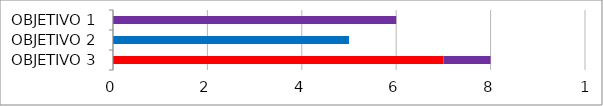
| Category | Series 0 | Series 1 | Series 2 |
|---|---|---|---|
| OBJETIVO 1 | 0 | 6 | 0 |
| OBJETIVO 2 | 0 | 0 | 5 |
| OBJETIVO 3 | 7 | 1 | 0 |